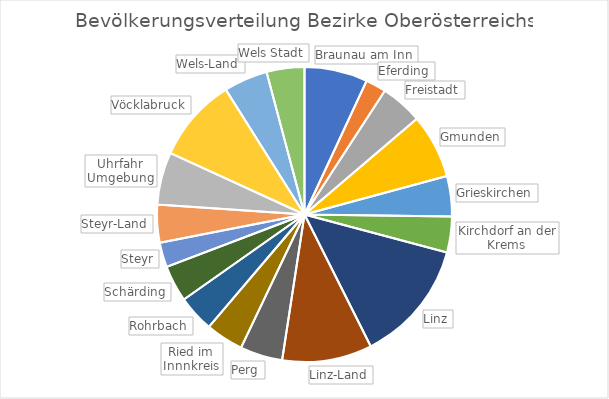
| Category | Series 0 |
|---|---|
| Braunau am Inn | 97826 |
| Eferding | 31741 |
| Freistadt | 65113 |
| Gmunden | 99403 |
| Grieskirchen | 62555 |
| Kirchdorf an der Krems | 55557 |
| Linz | 189889 |
| Linz-Land | 139116 |
| Perg | 65738 |
| Ried im Innnkreis | 58553 |
| Rohrbach | 56688 |
| Schärding | 56426 |
| Steyr | 38205 |
| Steyr-Land | 58700 |
| Uhrfahr Umgebung | 81400 |
| Vöcklabruck | 130316 |
| Wels-Land | 67945 |
| Wels Stadt | 58591 |